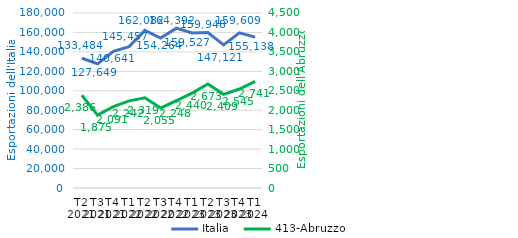
| Category | Italia |
|---|---|
| T2
2021 | 133483.888 |
| T3
2021 | 127649.236 |
| T4
2021 | 140640.693 |
| T1
2022 | 145456.777 |
| T2
2022 | 162082.232 |
| T3
2022 | 154263.82 |
| T4
2022 | 164391.954 |
| T1
2023 | 159526.512 |
| T2
2023 | 159947.55 |
| T3
2023 | 147121.043 |
| T4
2023 | 159609.352 |
| T1
2024 | 155138.295 |